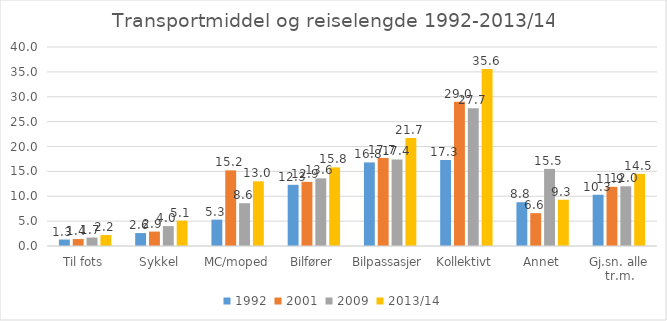
| Category | 1992 | 2001 | 2009 | 2013/14 |
|---|---|---|---|---|
| Til fots | 1.3 | 1.4 | 1.7 | 2.2 |
| Sykkel | 2.6 | 2.9 | 4 | 5.1 |
| MC/moped | 5.3 | 15.2 | 8.6 | 13 |
| Bilfører | 12.3 | 12.9 | 13.6 | 15.8 |
| Bilpassasjer | 16.8 | 17.7 | 17.4 | 21.7 |
| Kollektivt | 17.3 | 29 | 27.7 | 35.6 |
| Annet | 8.8 | 6.6 | 15.5 | 9.3 |
| Gj.sn. alle tr.m. | 10.3 | 11.9 | 12 | 14.5 |